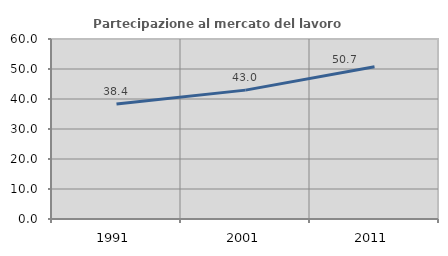
| Category | Partecipazione al mercato del lavoro  femminile |
|---|---|
| 1991.0 | 38.372 |
| 2001.0 | 42.96 |
| 2011.0 | 50.746 |